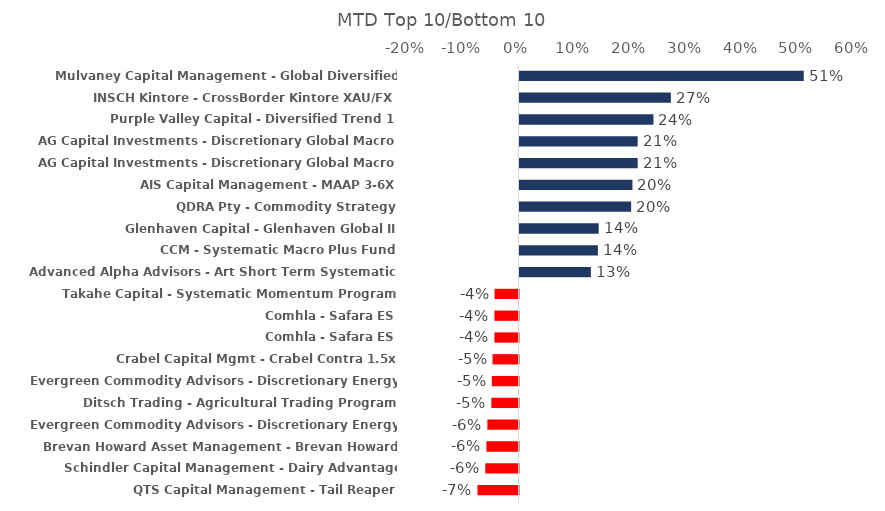
| Category | Series 0 |
|---|---|
| Mulvaney Capital Management - Global Diversified Program | 0.51 |
| INSCH Kintore - CrossBorder Kintore XAU/FX | 0.272 |
| Purple Valley Capital - Diversified Trend 1 | 0.24 |
| AG Capital Investments - Discretionary Global Macro | 0.212 |
| AG Capital Investments - Discretionary Global Macro | 0.212 |
| AIS Capital Management - MAAP 3-6X | 0.203 |
| QDRA Pty - Commodity Strategy | 0.2 |
| Glenhaven Capital - Glenhaven Global II | 0.142 |
| CCM - Systematic Macro Plus Fund | 0.141 |
| Advanced Alpha Advisors - Art Short Term Systematic | 0.128 |
| Takahe Capital - Systematic Momentum Program | -0.043 |
| Comhla - Safara ES | -0.043 |
| Comhla - Safara ES | -0.043 |
| Crabel Capital Mgmt - Crabel Contra 1.5x | -0.047 |
| Evergreen Commodity Advisors - Discretionary Energy Strategy | -0.048 |
| Ditsch Trading - Agricultural Trading Program | -0.049 |
| Evergreen Commodity Advisors - Discretionary Energy Select | -0.056 |
| Brevan Howard Asset Management - Brevan Howard Macro | -0.058 |
| Schindler Capital Management - Dairy Advantage Program | -0.06 |
| QTS Capital Management - Tail Reaper | -0.074 |